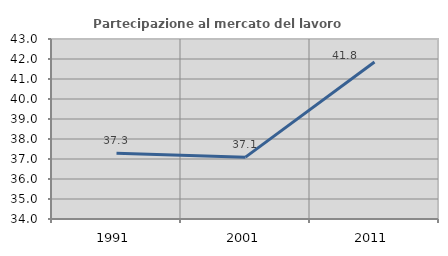
| Category | Partecipazione al mercato del lavoro  femminile |
|---|---|
| 1991.0 | 37.292 |
| 2001.0 | 37.093 |
| 2011.0 | 41.849 |